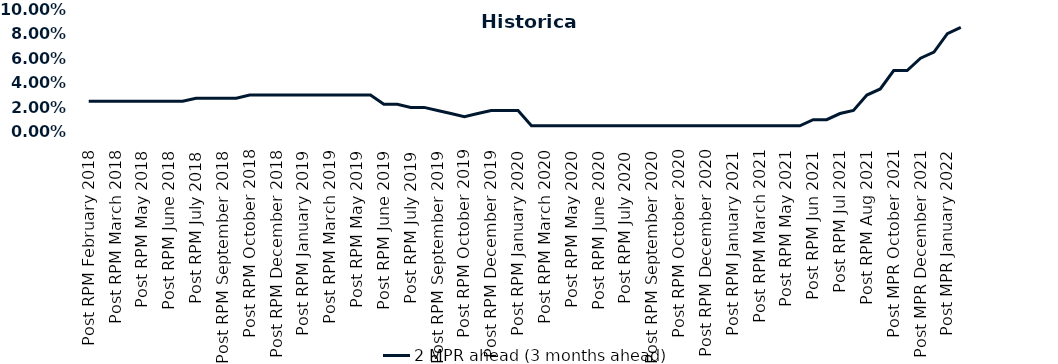
| Category | 2 MPR ahead (3 months ahead) |
|---|---|
| Post RPM February 2018 | 0.025 |
| Pre RPM March 2018 | 0.025 |
| Post RPM March 2018 | 0.025 |
| Pre RPM May 2018 | 0.025 |
| Post RPM May 2018 | 0.025 |
| Pre RPM June 2018 | 0.025 |
| Post RPM June 2018 | 0.025 |
| Pre RPM July 2018 | 0.025 |
| Post RPM July 2018 | 0.028 |
| Pre RPM September 2018 | 0.028 |
| Post RPM September 2018 | 0.028 |
| Pre RPM October 2018 | 0.028 |
| Post RPM October 2018 | 0.03 |
| Pre RPM December 2018 | 0.03 |
| Post RPM December 2018 | 0.03 |
| Pre RPM January 2019 | 0.03 |
| Post RPM January 2019 | 0.03 |
| Pre RPM March 2019 | 0.03 |
| Post RPM March 2019 | 0.03 |
| Pre RPM May 2019 | 0.03 |
| Post RPM May 2019 | 0.03 |
| Pre RPM June 2019 | 0.03 |
| Post RPM June 2019 | 0.022 |
| Pre RPM July 2019 | 0.022 |
| Post RPM July 2019 | 0.02 |
| Pre RPM September 2019 | 0.02 |
| Post RPM September 2019 | 0.018 |
| Pre RPM October 2019 | 0.015 |
| Post RPM October 2019 | 0.012 |
| Pre RPM December 2019 | 0.015 |
| Post RPM December 2019 | 0.018 |
| Pre RPM January 2020 | 0.018 |
| Post RPM January 2020 | 0.018 |
| Pre RPM March 2020 | 0.005 |
| Post RPM March 2020 | 0.005 |
| Pre RPM May 2020 | 0.005 |
| Post RPM May 2020 | 0.005 |
| Pre RPM June 2020 | 0.005 |
| Post RPM June 2020 | 0.005 |
| Pre RPM July 2020 | 0.005 |
| Post RPM July 2020 | 0.005 |
| Pre RPM September 2020 | 0.005 |
| Post RPM September 2020 | 0.005 |
| Pre RPM October 2020 | 0.005 |
| Post RPM October 2020 | 0.005 |
| Pre RPM December 2020 | 0.005 |
|  Post RPM December 2020 | 0.005 |
| Pre RPM January 2021 | 0.005 |
| Post RPM January 2021 | 0.005 |
|  Pre RPM March 2021 | 0.005 |
|  Post RPM March 2021 | 0.005 |
|  Pre RPM May 2021 | 0.005 |
|  Post RPM May 2021 | 0.005 |
|  Pre RPM Jun 2021 | 0.005 |
|   Post RPM Jun 2021 | 0.01 |
| Pre RPM Jul 2021 | 0.01 |
|  Post RPM Jul 2021 | 0.015 |
| Pre RPM Aug 2021 | 0.018 |
|  Post RPM Aug 2021 | 0.03 |
| Pre MPR October 2021 | 0.035 |
| Post MPR October 2021 | 0.05 |
| Pre MPR December 2021 | 0.05 |
| Post MPR December 2021 | 0.06 |
| Pre MPR January 2022 | 0.065 |
| Post MPR January 2022 | 0.08 |
| Pre MPR March 2022 | 0.085 |